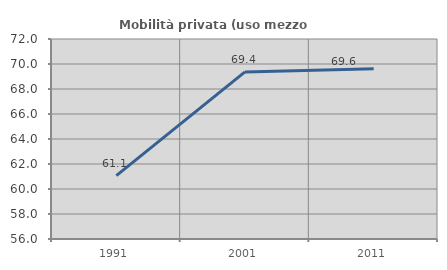
| Category | Mobilità privata (uso mezzo privato) |
|---|---|
| 1991.0 | 61.075 |
| 2001.0 | 69.369 |
| 2011.0 | 69.627 |